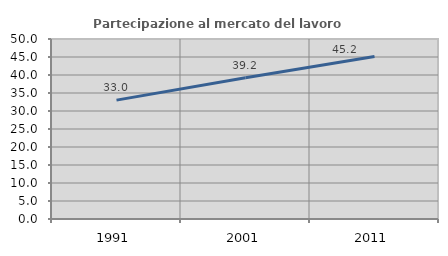
| Category | Partecipazione al mercato del lavoro  femminile |
|---|---|
| 1991.0 | 33.026 |
| 2001.0 | 39.247 |
| 2011.0 | 45.163 |